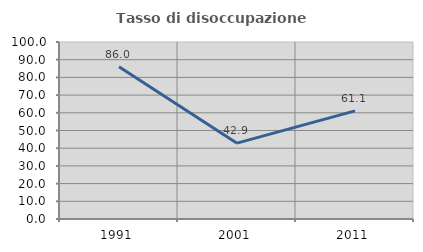
| Category | Tasso di disoccupazione giovanile  |
|---|---|
| 1991.0 | 86 |
| 2001.0 | 42.857 |
| 2011.0 | 61.111 |